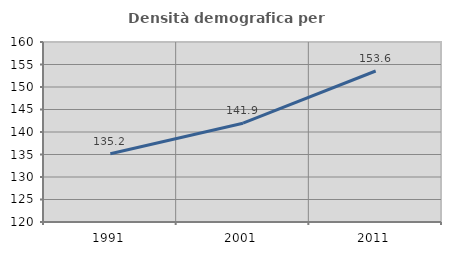
| Category | Densità demografica |
|---|---|
| 1991.0 | 135.151 |
| 2001.0 | 141.95 |
| 2011.0 | 153.558 |